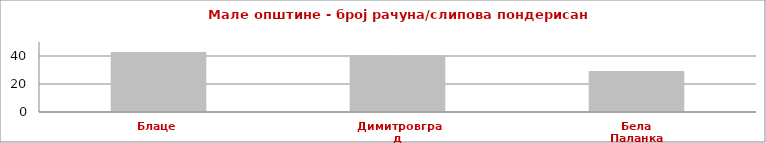
| Category | Series 0 |
|---|---|
| Блаце | 42.896 |
| Димитровград | 40.174 |
| Бела Паланка | 29.216 |